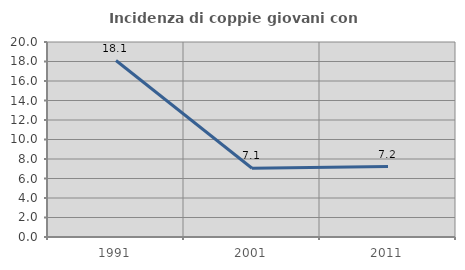
| Category | Incidenza di coppie giovani con figli |
|---|---|
| 1991.0 | 18.098 |
| 2001.0 | 7.051 |
| 2011.0 | 7.229 |